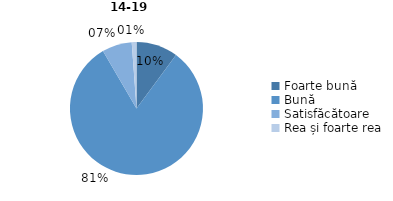
| Category | Series 0 |
|---|---|
| Foarte bună | 10.125 |
| Bună | 81.458 |
| Satisfăcătoare | 7.269 |
| Rea și foarte rea | 1.148 |